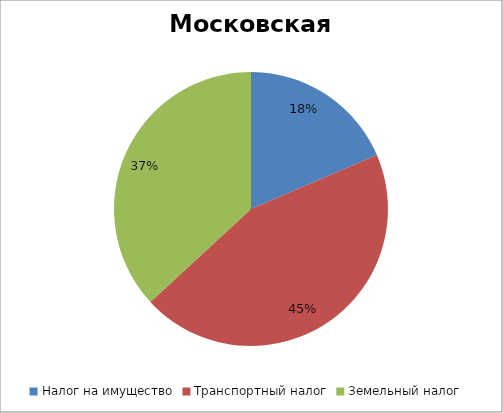
| Category | Московская область |
|---|---|
| Налог на имущество  | 5069631699.59 |
| Транспортный налог  | 12193691520.12 |
| Земельный налог  | 10079888021.96 |